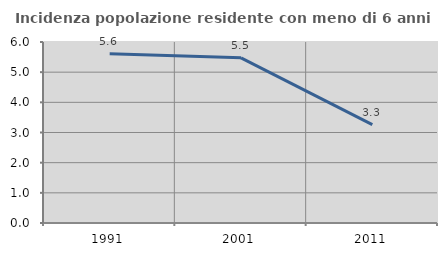
| Category | Incidenza popolazione residente con meno di 6 anni |
|---|---|
| 1991.0 | 5.613 |
| 2001.0 | 5.474 |
| 2011.0 | 3.261 |